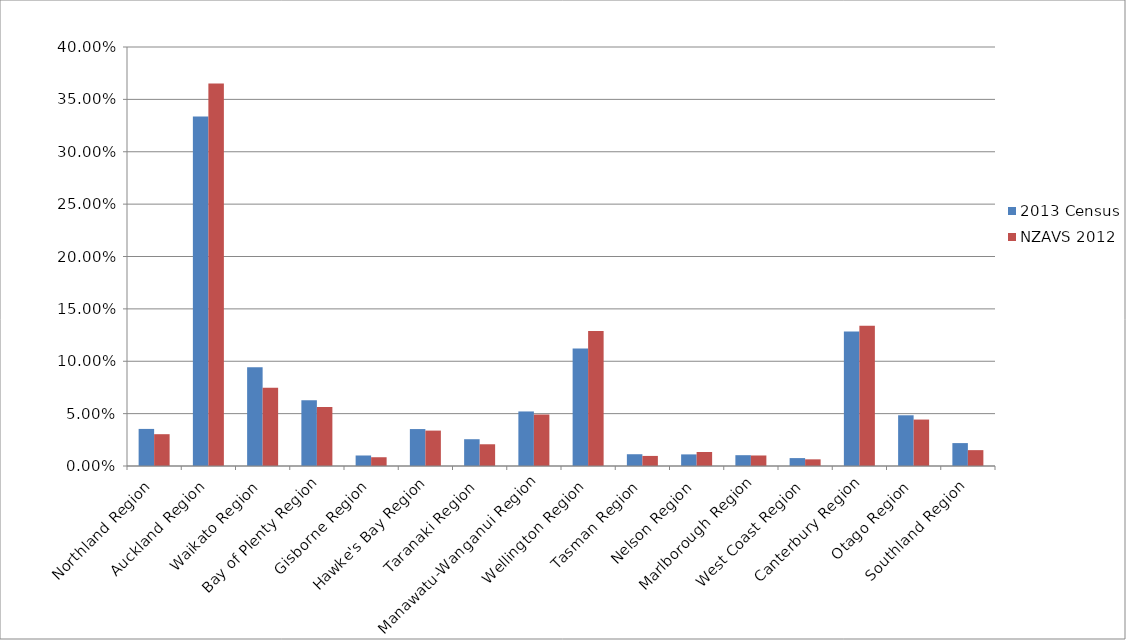
| Category | 2013 Census | NZAVS 2012 |
|---|---|---|
| Northland Region | 0.035 | 0.03 |
| Auckland Region | 0.334 | 0.365 |
| Waikato Region | 0.094 | 0.075 |
| Bay of Plenty Region | 0.063 | 0.056 |
| Gisborne Region | 0.01 | 0.008 |
| Hawke's Bay Region | 0.035 | 0.034 |
| Taranaki Region | 0.026 | 0.021 |
| Manawatu-Wanganui Region | 0.052 | 0.049 |
| Wellington Region | 0.112 | 0.129 |
| Tasman Region | 0.011 | 0.01 |
| Nelson Region | 0.011 | 0.013 |
| Marlborough Region | 0.01 | 0.01 |
| West Coast Region | 0.008 | 0.006 |
| Canterbury Region | 0.129 | 0.134 |
| Otago Region | 0.048 | 0.044 |
| Southland Region | 0.022 | 0.015 |